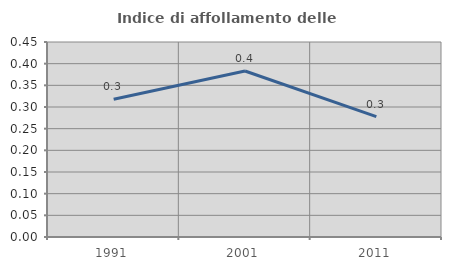
| Category | Indice di affollamento delle abitazioni  |
|---|---|
| 1991.0 | 0.318 |
| 2001.0 | 0.383 |
| 2011.0 | 0.278 |